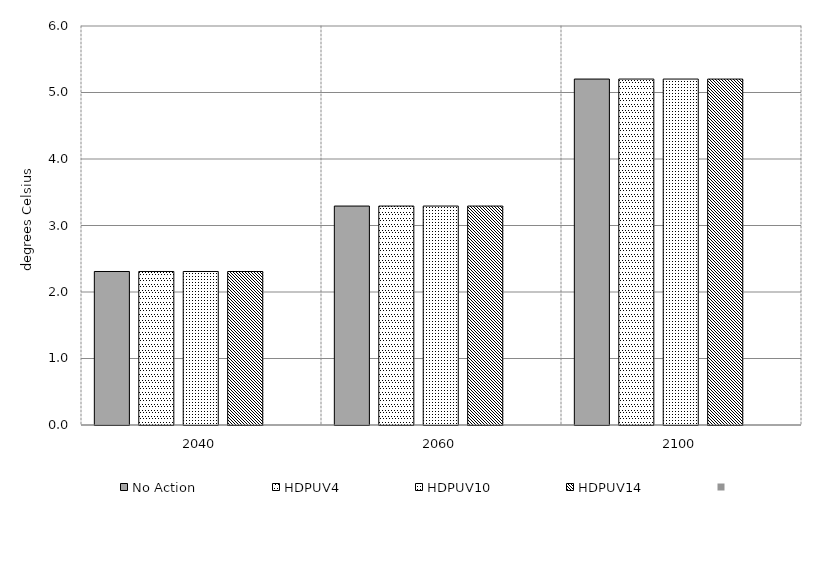
| Category | No Action | HDPUV4 | HDPUV10 | HDPUV14 | Series 4 | Alt 5 | Alt 6 | Alt 7 | Alt 8 | Alt 10 |
|---|---|---|---|---|---|---|---|---|---|---|
| 2040.0 | 2.308 | 2.308 | 2.308 | 2.308 |  |  |  |  |  |  |
| 2060.0 | 3.292 | 3.292 | 3.292 | 3.292 |  |  |  |  |  |  |
| 2100.0 | 5.202 | 5.202 | 5.202 | 5.202 |  |  |  |  |  |  |